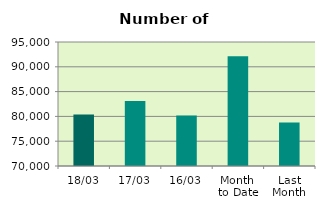
| Category | Series 0 |
|---|---|
| 18/03 | 80358 |
| 17/03 | 83088 |
| 16/03 | 80162 |
| Month 
to Date | 92126 |
| Last
Month | 78748.7 |